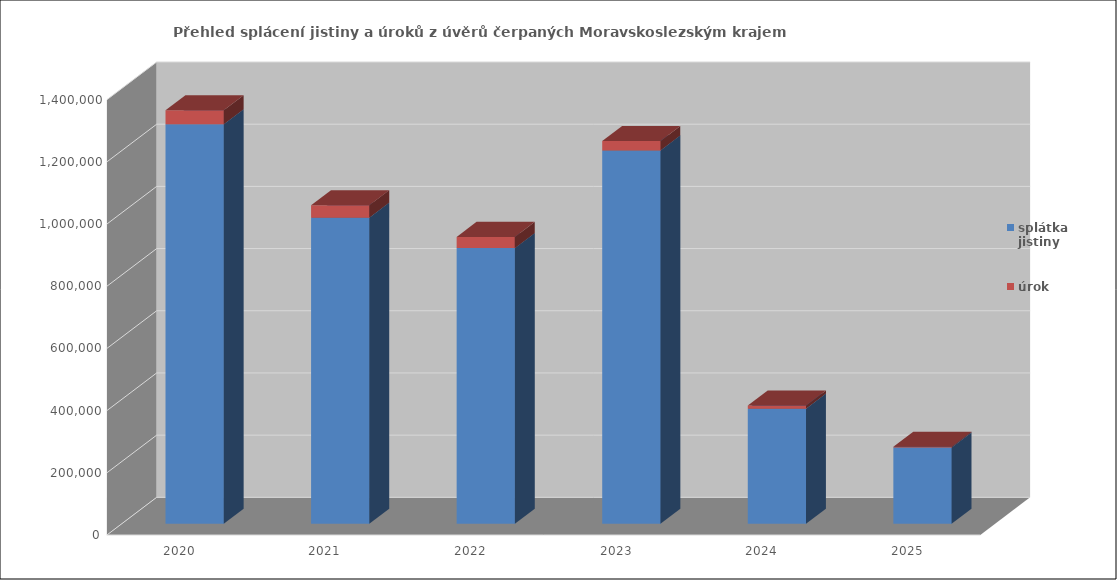
| Category | splátka jistiny | úrok |
|---|---|---|
| 2020.0 | 1284763.04 | 45000 |
| 2021.0 | 984259 | 40000 |
| 2022.0 | 886277 | 36000 |
| 2023.0 | 1200414 | 30000 |
| 2024.0 | 370000 | 9800 |
| 2025.0 | 244990 | 2400 |